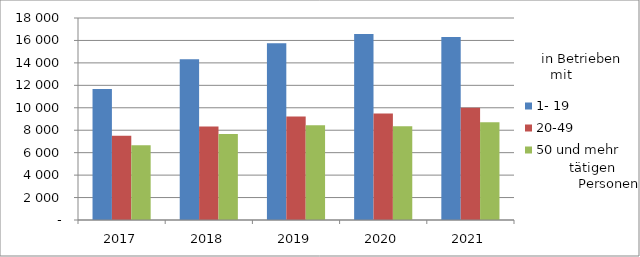
| Category | 1- 19 | 20-49 | 50 und mehr |
|---|---|---|---|
| 2017.0 | 11682 | 7507 | 6671 |
| 2018.0 | 14315 | 8321 | 7663 |
| 2019.0 | 15756 | 9231 | 8442 |
| 2020.0 | 16578 | 9495 | 8365 |
| 2021.0 | 16314 | 9999 | 8709 |